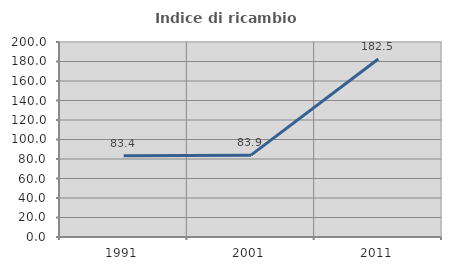
| Category | Indice di ricambio occupazionale  |
|---|---|
| 1991.0 | 83.439 |
| 2001.0 | 83.938 |
| 2011.0 | 182.54 |